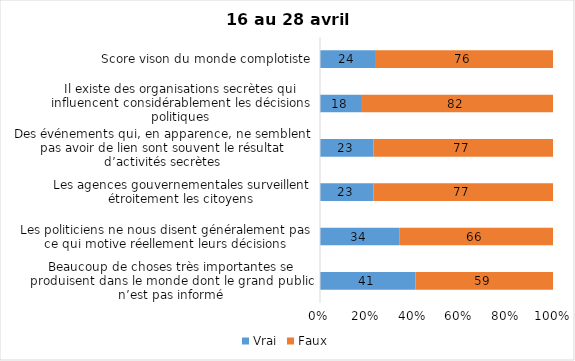
| Category | Vrai | Faux |
|---|---|---|
| Beaucoup de choses très importantes se produisent dans le monde dont le grand public n’est pas informé | 41 | 59 |
| Les politiciens ne nous disent généralement pas ce qui motive réellement leurs décisions | 34 | 66 |
| Les agences gouvernementales surveillent étroitement les citoyens | 23 | 77 |
| Des événements qui, en apparence, ne semblent pas avoir de lien sont souvent le résultat d’activités secrètes | 23 | 77 |
| Il existe des organisations secrètes qui influencent considérablement les décisions politiques | 18 | 82 |
| Score vison du monde complotiste | 24 | 76 |